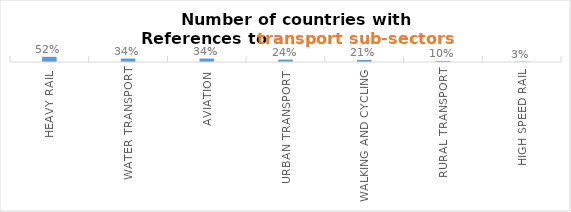
| Category | Series 0 |
|---|---|
| Heavy Rail | 0.517 |
| Water transport | 0.345 |
| Aviation | 0.345 |
| Urban Transport  | 0.241 |
| Walking and Cycling | 0.207 |
| Rural Transport | 0.103 |
| High Speed Rail | 0.034 |